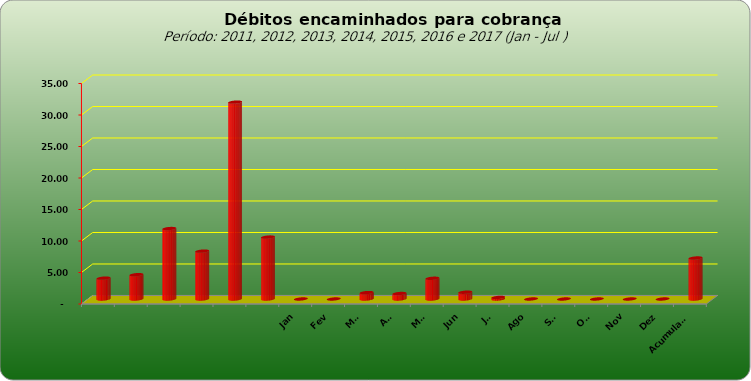
| Category |  3.309.443,02  |
|---|---|
|  | 3309443.02 |
|  | 3859728.44 |
|  | 11181928.25 |
|  | 7600526.01 |
|  | 31248623.5 |
|  | 9830198.34 |
| Jan | 0 |
| Fev | 0 |
| Mar | 1019401.01 |
| Abr | 870947.61 |
| Mai | 3287717.74 |
| Jun | 1079067.67 |
| Jul | 249791.68 |
| Ago | 0 |
| Set | 0 |
| Out | 0 |
| Nov | 0 |
| Dez | 0 |
| Acumulado | 6506925.71 |